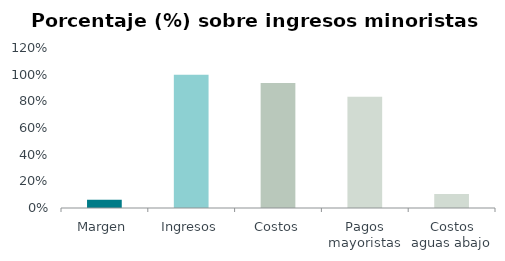
| Category | Series 0 |
|---|---|
| Margen | 0.062 |
| Ingresos | 1 |
| Costos | 0.938 |
| Pagos mayoristas | 0.834 |
| Costos aguas abajo | 0.104 |